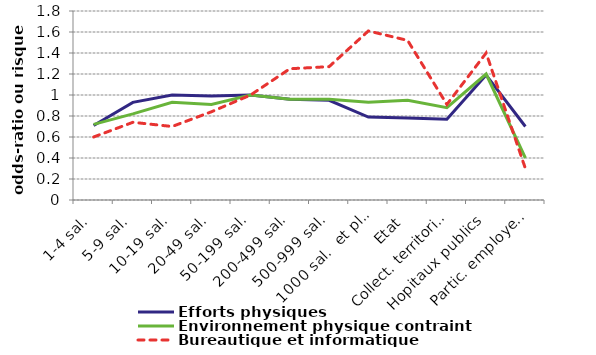
| Category | Efforts physiques | Environnement physique contraint | Bureautique et informatique |
|---|---|---|---|
|  1-4 sal. | 0.71 | 0.72 | 0.6 |
|  5-9 sal. | 0.93 | 0.82 | 0.74 |
|  10-19 sal. | 1 | 0.93 | 0.7 |
| 20-49 sal. | 0.99 | 0.91 | 0.84 |
|  50-199 sal. | 1 | 1 | 1 |
|  200-499 sal. | 0.96 | 0.96 | 1.25 |
|  500-999 sal. | 0.95 | 0.96 | 1.27 |
|  1000 sal.  et plus | 0.79 | 0.93 | 1.61 |
| Etat | 0.78 | 0.95 | 1.52 |
| Collect. territoriales | 0.77 | 0.88 | 0.91 |
| Hopitaux publics | 1.19 | 1.2 | 1.4 |
| Partic. employeurs | 0.7 | 0.4 | 0.3 |